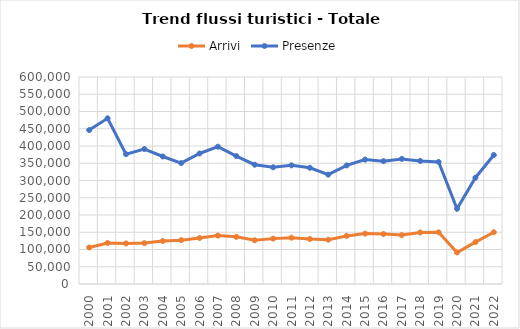
| Category | Arrivi | Presenze |
|---|---|---|
| 2000.0 | 105811 | 446180 |
| 2001.0 | 118912 | 480276 |
| 2002.0 | 117530 | 376394 |
| 2003.0 | 118508 | 391221 |
| 2004.0 | 124551 | 369631 |
| 2005.0 | 127065 | 350583 |
| 2006.0 | 133305 | 378269 |
| 2007.0 | 140417 | 397960 |
| 2008.0 | 136661 | 370758 |
| 2009.0 | 126700 | 345810 |
| 2010.0 | 131526 | 338307 |
| 2011.0 | 134285 | 343906 |
| 2012.0 | 130366 | 336857 |
| 2013.0 | 128358 | 317015 |
| 2014.0 | 139274 | 343716 |
| 2015.0 | 146025 | 360592 |
| 2016.0 | 144884 | 356074 |
| 2017.0 | 141908 | 362610 |
| 2018.0 | 149452 | 356796 |
| 2019.0 | 149782 | 353773 |
| 2020.0 | 91344 | 218149 |
| 2021.0 | 121473 | 308076 |
| 2022.0 | 150085 | 373865 |